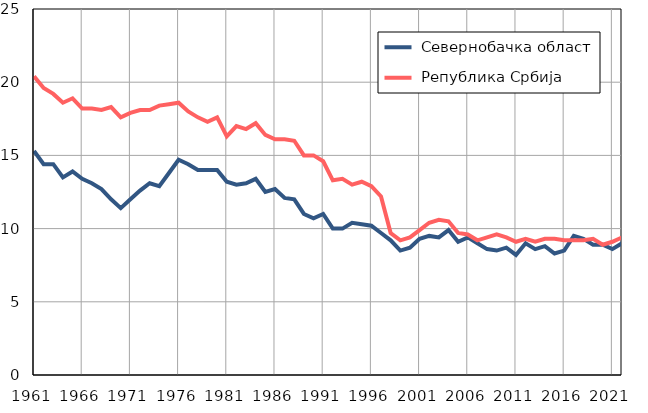
| Category |  Севернобачка област |  Република Србија |
|---|---|---|
| 1961.0 | 15.3 | 20.4 |
| 1962.0 | 14.4 | 19.6 |
| 1963.0 | 14.4 | 19.2 |
| 1964.0 | 13.5 | 18.6 |
| 1965.0 | 13.9 | 18.9 |
| 1966.0 | 13.4 | 18.2 |
| 1967.0 | 13.1 | 18.2 |
| 1968.0 | 12.7 | 18.1 |
| 1969.0 | 12 | 18.3 |
| 1970.0 | 11.4 | 17.6 |
| 1971.0 | 12 | 17.9 |
| 1972.0 | 12.6 | 18.1 |
| 1973.0 | 13.1 | 18.1 |
| 1974.0 | 12.9 | 18.4 |
| 1975.0 | 13.8 | 18.5 |
| 1976.0 | 14.7 | 18.6 |
| 1977.0 | 14.4 | 18 |
| 1978.0 | 14 | 17.6 |
| 1979.0 | 14 | 17.3 |
| 1980.0 | 14 | 17.6 |
| 1981.0 | 13.2 | 16.3 |
| 1982.0 | 13 | 17 |
| 1983.0 | 13.1 | 16.8 |
| 1984.0 | 13.4 | 17.2 |
| 1985.0 | 12.5 | 16.4 |
| 1986.0 | 12.7 | 16.1 |
| 1987.0 | 12.1 | 16.1 |
| 1988.0 | 12 | 16 |
| 1989.0 | 11 | 15 |
| 1990.0 | 10.7 | 15 |
| 1991.0 | 11 | 14.6 |
| 1992.0 | 10 | 13.3 |
| 1993.0 | 10 | 13.4 |
| 1994.0 | 10.4 | 13 |
| 1995.0 | 10.3 | 13.2 |
| 1996.0 | 10.2 | 12.9 |
| 1997.0 | 9.7 | 12.2 |
| 1998.0 | 9.2 | 9.7 |
| 1999.0 | 8.5 | 9.2 |
| 2000.0 | 8.7 | 9.4 |
| 2001.0 | 9.3 | 9.9 |
| 2002.0 | 9.5 | 10.4 |
| 2003.0 | 9.4 | 10.6 |
| 2004.0 | 9.9 | 10.5 |
| 2005.0 | 9.1 | 9.7 |
| 2006.0 | 9.4 | 9.6 |
| 2007.0 | 9 | 9.2 |
| 2008.0 | 8.6 | 9.4 |
| 2009.0 | 8.5 | 9.6 |
| 2010.0 | 8.7 | 9.4 |
| 2011.0 | 8.2 | 9.1 |
| 2012.0 | 9 | 9.3 |
| 2013.0 | 8.6 | 9.1 |
| 2014.0 | 8.8 | 9.3 |
| 2015.0 | 8.3 | 9.3 |
| 2016.0 | 8.5 | 9.2 |
| 2017.0 | 9.5 | 9.2 |
| 2018.0 | 9.3 | 9.2 |
| 2019.0 | 8.9 | 9.3 |
| 2020.0 | 8.9 | 8.9 |
| 2021.0 | 8.6 | 9.1 |
| 2022.0 | 9 | 9.4 |